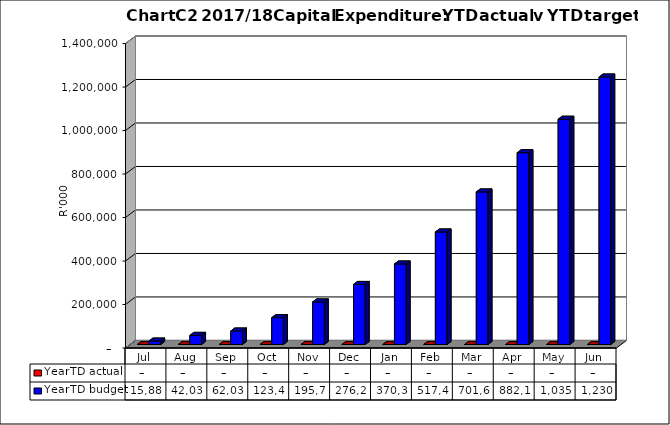
| Category | YearTD actual | YearTD budget |
|---|---|---|
| Jul | 0 | 15888227.121 |
| Aug | 0 | 42035272.322 |
| Sep | 0 | 62035272.322 |
| Oct | 0 | 123459362.725 |
| Nov | 0 | 195759882.867 |
| Dec | 0 | 276210403.008 |
| Jan | 0 | 370327465.529 |
| Feb | 0 | 517445513.065 |
| Mar | 0 | 701612575.586 |
| Apr | 0 | 882132384.943 |
| May | 0 | 1035958624.038 |
| Jun | 0 | 1230118000 |